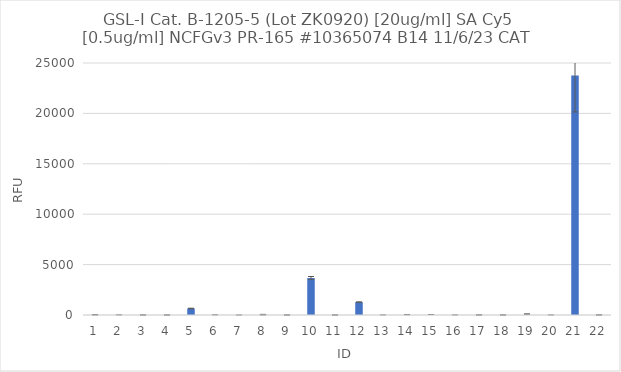
| Category | RFU |
|---|---|
| 0 | 23 |
| 1 | 5.75 |
| 2 | 4.5 |
| 3 | 1.25 |
| 4 | 649.75 |
| 5 | 9.5 |
| 6 | 0 |
| 7 | 33 |
| 8 | 1.75 |
| 9 | 3665 |
| 10 | -49.25 |
| 11 | 1279.5 |
| 12 | 4 |
| 13 | -21.75 |
| 14 | -10.75 |
| 15 | 3.5 |
| 16 | 5.75 |
| 17 | 4.75 |
| 18 | -75.25 |
| 19 | 2.75 |
| 20 | 23749.25 |
| 21 | 6.5 |